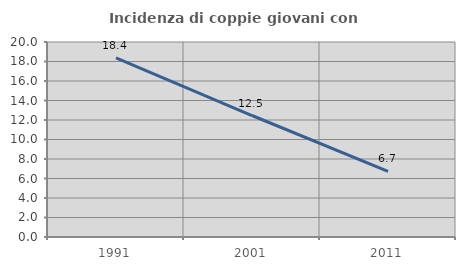
| Category | Incidenza di coppie giovani con figli |
|---|---|
| 1991.0 | 18.38 |
| 2001.0 | 12.461 |
| 2011.0 | 6.732 |